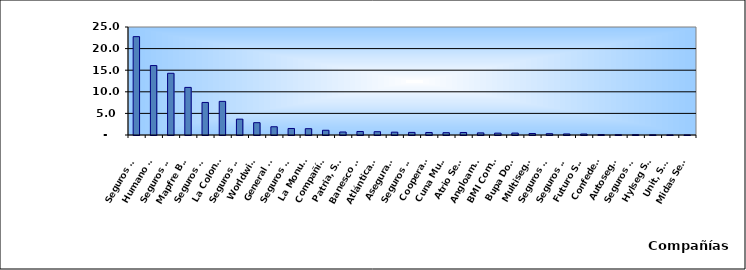
| Category | Series 0 |
|---|---|
| Seguros Universal, S. A. | 22.765 |
| Humano Seguros, S. A. | 16.073 |
| Seguros Reservas, S. A. | 14.285 |
| Mapfre BHD Compañía de Seguros | 11.019 |
| Seguros Sura, S.A. | 7.537 |
| La Colonial, S. A., Compañia De Seguros | 7.784 |
| Seguros Crecer, S. A. | 3.669 |
| Worldwide Seguros, S. A. | 2.852 |
| General de Seguros, S. A. | 1.907 |
| Seguros Pepín, S. A. | 1.511 |
| La Monumental de Seguros, S. A. | 1.459 |
| Compañía Dominicana de Seguros, C. por A. | 1.097 |
| Patria, S. A., Compañía de Seguros | 0.695 |
| Banesco Seguros | 0.813 |
| Atlántica Seguros, S. A. | 0.76 |
| Aseguradora Agropecuaria Dominicana, S. A. | 0.657 |
| Seguros La Internacional, S. A. | 0.603 |
| Cooperativa Nacional De Seguros, Inc  | 0.581 |
| Cuna Mutual Insurance Society Dominicana | 0.537 |
| Atrio Seguros S. A. | 0.581 |
| Angloamericana de Seguros, S. A. | 0.49 |
| BMI Compañía de Seguros, S. A. | 0.433 |
| Bupa Dominicana, S. A. | 0.444 |
| Multiseguros Su, S.A. | 0.346 |
| Seguros APS, S.R.L. | 0.303 |
| Seguros Ademi, S.A. | 0.246 |
| Futuro Seguros | 0.228 |
| Confederación del Canadá Dominicana, S. A. | 0.104 |
| Autoseguro, S. A. | 0.067 |
| Seguros Yunen, S.A. | 0.077 |
| Hylseg Seguros S.A | 0.044 |
| Unit, S.A. | 0.021 |
| Midas Seguros, S.A. | 0.013 |